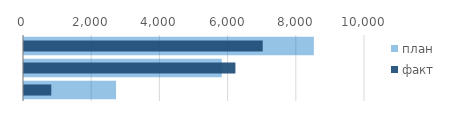
| Category | план |
|---|---|
|  | 8500 |
|  | 5800 |
|  | 2700 |